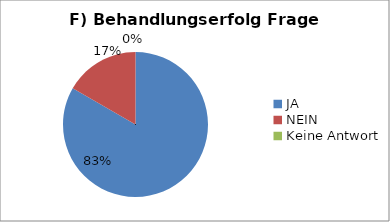
| Category | Series 0 |
|---|---|
| JA | 35 |
| NEIN | 7 |
| Keine Antwort | 0 |